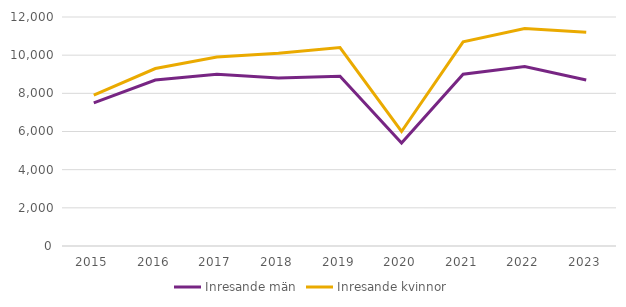
| Category | Inresande män | Inresande kvinnor |
|---|---|---|
| 2015.0 | 7500 | 7900 |
| 2016.0 | 8700 | 9300 |
| 2017.0 | 9000 | 9900 |
| 2018.0 | 8800 | 10100 |
| 2019.0 | 8900 | 10400 |
| 2020.0 | 5400 | 6000 |
| 2021.0 | 9000 | 10700 |
| 2022.0 | 9400 | 11400 |
| 2023.0 | 8700 | 11200 |